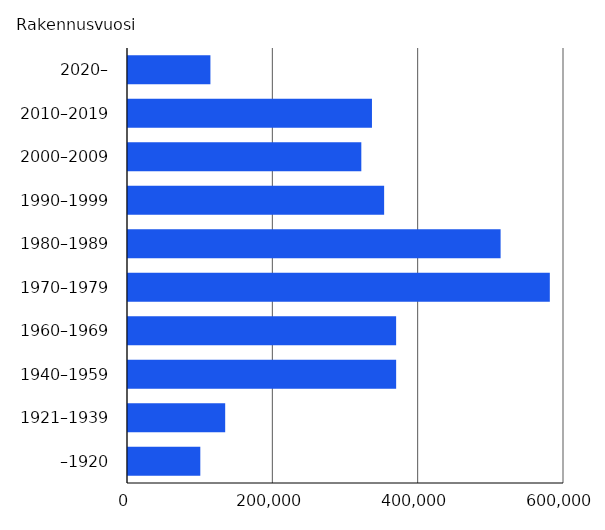
| Category | Asuntojen lukumäärä |
|---|---|
| –1920 | 99510 |
| 1921–1939 | 133747 |
| 1940–1959 | 369012 |
| 1960–1969 | 368981 |
| 1970–1979 | 580485 |
| 1980–1989 | 512761 |
| 1990–1999 | 352478 |
| 2000–2009 | 321082 |
| 2010–2019 | 335730 |
| 2020– | 113424 |